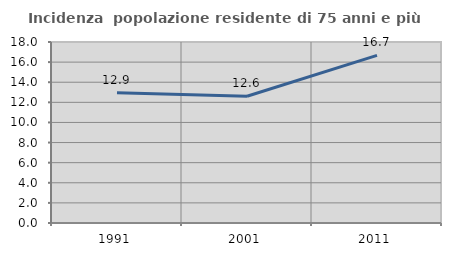
| Category | Incidenza  popolazione residente di 75 anni e più |
|---|---|
| 1991.0 | 12.948 |
| 2001.0 | 12.609 |
| 2011.0 | 16.667 |